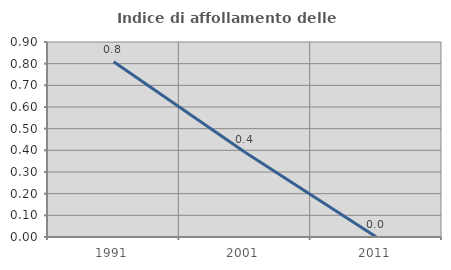
| Category | Indice di affollamento delle abitazioni  |
|---|---|
| 1991.0 | 0.809 |
| 2001.0 | 0.391 |
| 2011.0 | 0 |